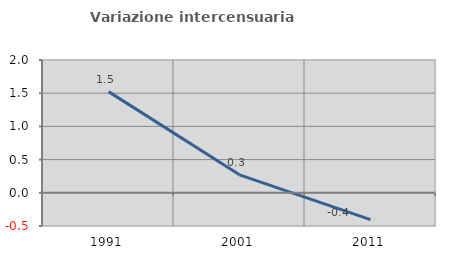
| Category | Variazione intercensuaria annua |
|---|---|
| 1991.0 | 1.524 |
| 2001.0 | 0.27 |
| 2011.0 | -0.403 |